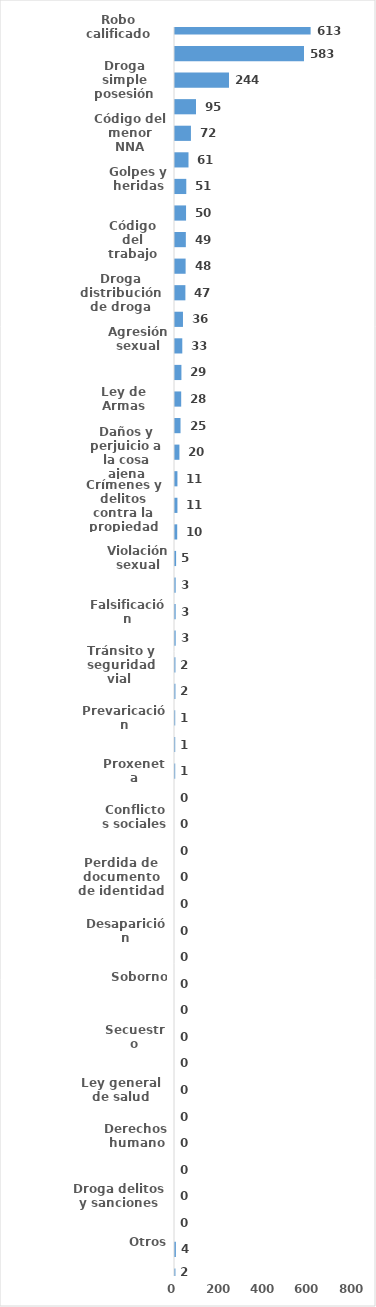
| Category | Series 0 |
|---|---|
| Robo calificado | 613 |
| Violencia intrafamiliar | 583 |
| Droga simple posesión | 244 |
| Violencia de género | 95 |
| Código del menor NNA | 72 |
| Crímenes y delitos de alta tecnología | 61 |
| Golpes y heridas | 51 |
| Amenaza | 50 |
| Código del trabajo | 49 |
| Droga traficante de droga | 48 |
| Droga distribución de droga | 47 |
| Abuso de confianza | 36 |
| Agresión sexual | 33 |
| Protección Animal y Tenencia Responsable | 29 |
| Ley de Armas | 28 |
| Estafa | 25 |
| Daños y perjuicio a la cosa ajena | 20 |
| Asociación de malhechores | 11 |
| Crímenes y delitos contra la propiedad | 11 |
| Robo simple | 10 |
| Violación sexual | 5 |
| Homicidio | 3 |
| Falsificación | 3 |
| Tentativa de homicidio | 3 |
| Tránsito y seguridad vial  | 2 |
| Droga sanciones y circunstancias agravantes | 2 |
| Prevaricación | 1 |
| Ley de cheque | 1 |
| Proxeneta | 1 |
| Desfalco | 0 |
| Conflictos sociales | 0 |
| Difamación e injuria | 0 |
| Perdida de documento de identidad | 0 |
| Propiedad industrial, intelectual y derecho de autor | 0 |
| Desaparición | 0 |
| Tráfico ilícito de migrantes y trata de personas | 0 |
| Soborno | 0 |
| Medio ambiente y recursos naturales | 0 |
| Secuestro | 0 |
| Juego de azar | 0 |
| Ley general de salud | 0 |
| Contra el lavado de activo  | 0 |
| Derechos humano | 0 |
| Terrorismo | 0 |
| Droga delitos y sanciones | 0 |
| Aborto y tentativa | 0 |
| Otros | 4 |
| Indeterminados | 2 |